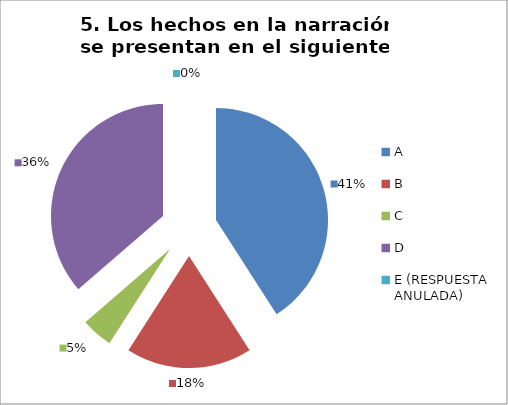
| Category | CANTIDAD DE RESPUESTAS PREGUNTA (5) | PORCENTAJE |
|---|---|---|
| A | 9 | 0.409 |
| B | 4 | 0.182 |
| C | 1 | 0.045 |
| D | 8 | 0.364 |
| E (RESPUESTA ANULADA) | 0 | 0 |